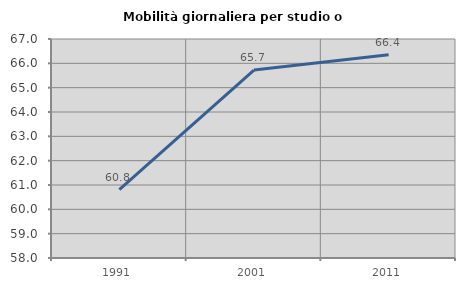
| Category | Mobilità giornaliera per studio o lavoro |
|---|---|
| 1991.0 | 60.814 |
| 2001.0 | 65.723 |
| 2011.0 | 66.351 |